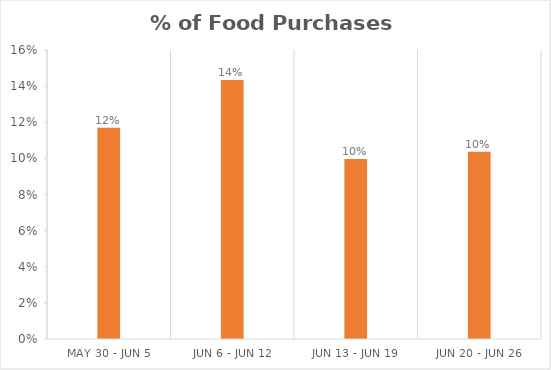
| Category | % of Food Purchases Wasted |
|---|---|
| May 30 - Jun 5 | 0.117 |
| Jun 6 - Jun 12 | 0.143 |
| Jun 13 - Jun 19 | 0.1 |
| Jun 20 - Jun 26 | 0.104 |